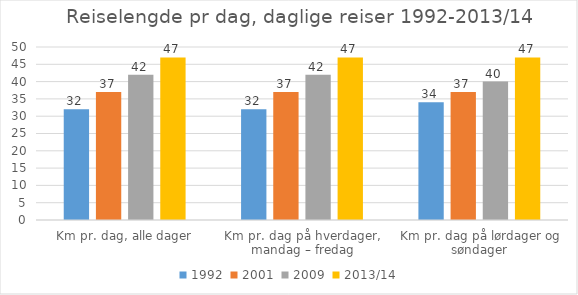
| Category | 1992 | 2001 | 2009 | 2013/14 |
|---|---|---|---|---|
| Km pr. dag, alle dager | 32 | 37 | 42 | 47 |
| Km pr. dag på hverdager, mandag – fredag | 32 | 37 | 42 | 47 |
| Km pr. dag på lørdager og søndager | 34 | 37 | 40 | 47 |